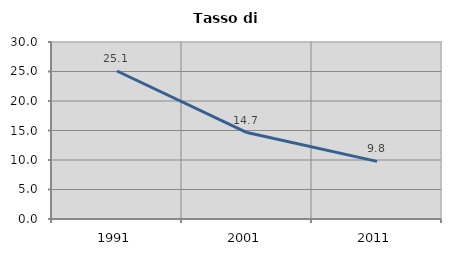
| Category | Tasso di disoccupazione   |
|---|---|
| 1991.0 | 25.084 |
| 2001.0 | 14.653 |
| 2011.0 | 9.769 |